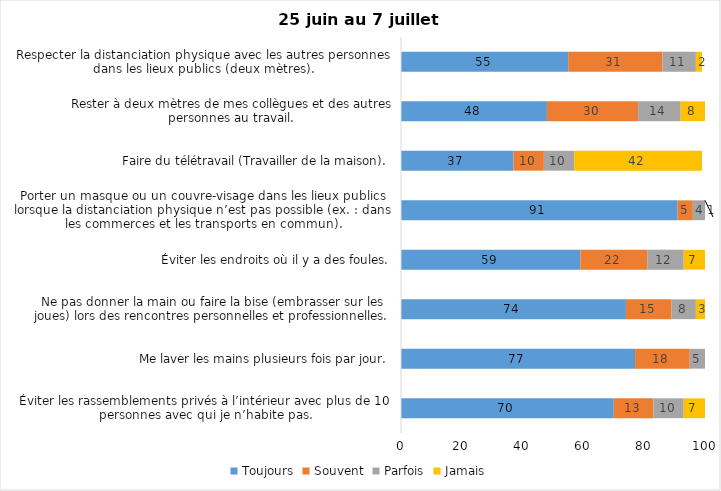
| Category | Toujours | Souvent | Parfois | Jamais |
|---|---|---|---|---|
| Éviter les rassemblements privés à l’intérieur avec plus de 10 personnes avec qui je n’habite pas. | 70 | 13 | 10 | 7 |
| Me laver les mains plusieurs fois par jour. | 77 | 18 | 5 | 0 |
| Ne pas donner la main ou faire la bise (embrasser sur les joues) lors des rencontres personnelles et professionnelles. | 74 | 15 | 8 | 3 |
| Éviter les endroits où il y a des foules. | 59 | 22 | 12 | 7 |
| Porter un masque ou un couvre-visage dans les lieux publics lorsque la distanciation physique n’est pas possible (ex. : dans les commerces et les transports en commun). | 91 | 5 | 4 | 1 |
| Faire du télétravail (Travailler de la maison). | 37 | 10 | 10 | 42 |
| Rester à deux mètres de mes collègues et des autres personnes au travail. | 48 | 30 | 14 | 8 |
| Respecter la distanciation physique avec les autres personnes dans les lieux publics (deux mètres). | 55 | 31 | 11 | 2 |